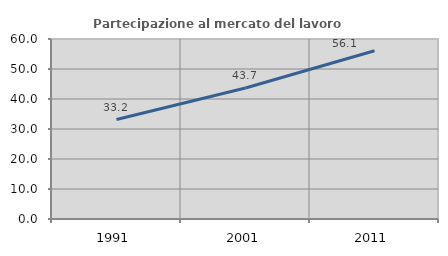
| Category | Partecipazione al mercato del lavoro  femminile |
|---|---|
| 1991.0 | 33.161 |
| 2001.0 | 43.662 |
| 2011.0 | 56.075 |